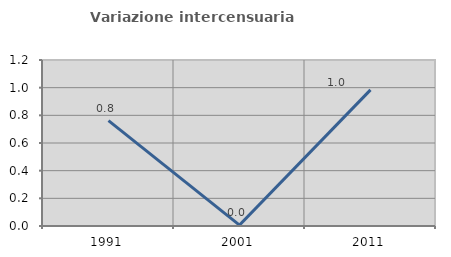
| Category | Variazione intercensuaria annua |
|---|---|
| 1991.0 | 0.762 |
| 2001.0 | 0.007 |
| 2011.0 | 0.984 |